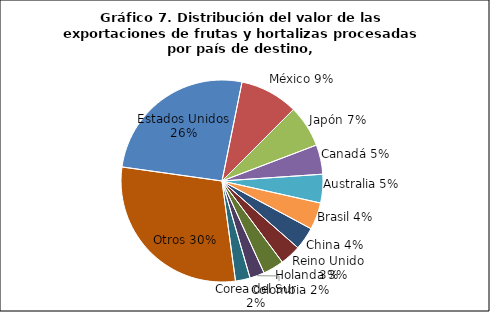
| Category | Series 0 |
|---|---|
| Estados Unidos | 183429928.44 |
| México | 65846876.27 |
| Japón | 47417995.43 |
| Canadá | 33347913.49 |
| Australia | 32389422.95 |
| Brasil | 30597921.43 |
| China | 25764608.1 |
| Reino Unido | 23646924.12 |
| Holanda | 23614060.06 |
| Colombia | 16597077.18 |
| Corea del Sur | 16550958.81 |
| Otros | 207498199.69 |